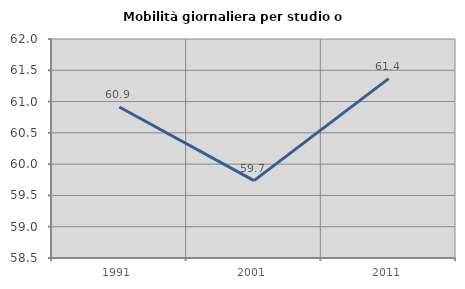
| Category | Mobilità giornaliera per studio o lavoro |
|---|---|
| 1991.0 | 60.912 |
| 2001.0 | 59.737 |
| 2011.0 | 61.367 |